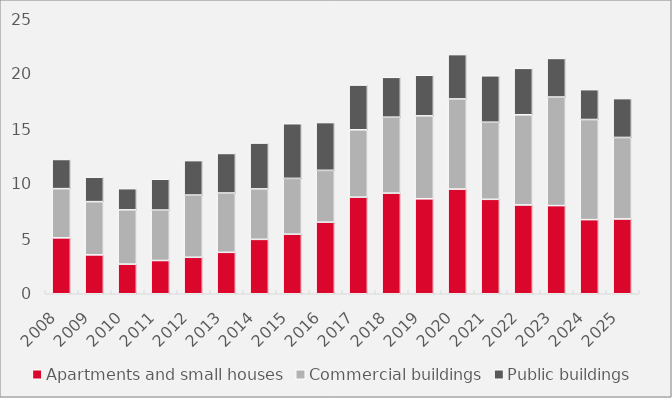
| Category | Apartments and small houses | Commercial buildings | Public buildings |
|---|---|---|---|
| 2008.0 | 5.081 | 4.476 | 2.65 |
| 2009.0 | 3.535 | 4.84 | 2.222 |
| 2010.0 | 2.696 | 4.932 | 1.926 |
| 2011.0 | 3.022 | 4.587 | 2.806 |
| 2012.0 | 3.314 | 5.657 | 3.134 |
| 2013.0 | 3.764 | 5.394 | 3.596 |
| 2014.0 | 4.945 | 4.587 | 4.168 |
| 2015.0 | 5.413 | 5.074 | 4.972 |
| 2016.0 | 6.505 | 4.714 | 4.343 |
| 2017.0 | 8.78 | 6.125 | 4.066 |
| 2018.0 | 9.145 | 6.907 | 3.621 |
| 2019.0 | 8.632 | 7.541 | 3.696 |
| 2020.0 | 9.514 | 8.197 | 4.031 |
| 2021.0 | 8.584 | 7.011 | 4.221 |
| 2022.0 | 8.07 | 8.201 | 4.221 |
| 2023.0 | 8.015 | 9.867 | 3.51 |
| 2024.0 | 6.738 | 9.102 | 2.714 |
| 2025.0 | 6.801 | 7.408 | 3.531 |